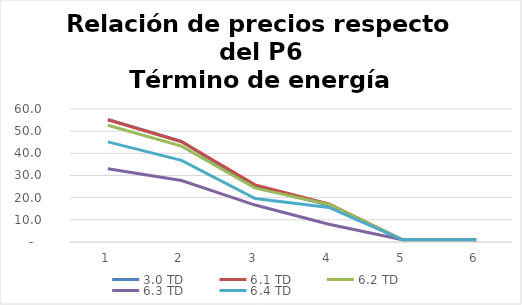
| Category | 3.0 TD | 6.1 TD | 6.2 TD | 6.3 TD | 6.4 TD |
|---|---|---|---|---|---|
| 0 | 55.302 | 55.124 | 52.69 | 33.081 | 45.167 |
| 1 | 45.38 | 45.229 | 43.27 | 27.723 | 36.814 |
| 2 | 24.782 | 25.79 | 24.299 | 16.668 | 19.635 |
| 3 | 16.701 | 17.232 | 16.977 | 8 | 15.596 |
| 4 | 1 | 1 | 1 | 1 | 1 |
| 5 | 1 | 1 | 1 | 1 | 1 |